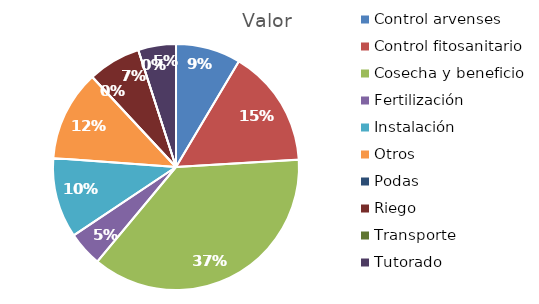
| Category | Valor |
|---|---|
| Control arvenses | 2150000 |
| Control fitosanitario | 3900000 |
| Cosecha y beneficio | 9310000 |
| Fertilización | 1150000 |
| Instalación | 2650000 |
| Otros | 3000000 |
| Podas | 0 |
| Riego | 1750000 |
| Transporte | 0 |
| Tutorado | 1250000 |